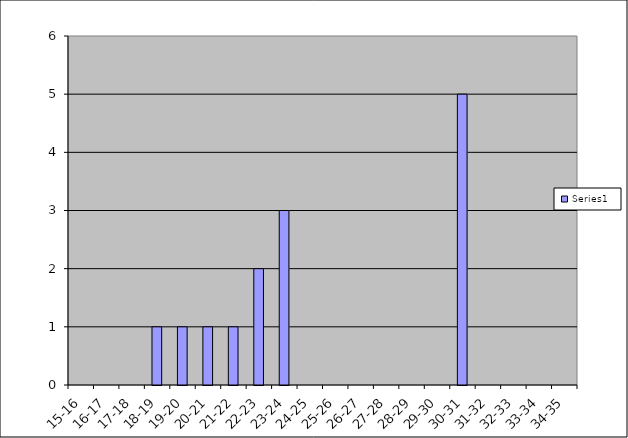
| Category | Series 0 |
|---|---|
| 15-16 | 0 |
| 16-17 | 0 |
| 17-18 | 0 |
| 18-19 | 1 |
| 19-20 | 1 |
| 20-21 | 1 |
| 21-22 | 1 |
| 22-23 | 2 |
| 23-24 | 3 |
| 24-25 | 0 |
| 25-26 | 0 |
| 26-27 | 0 |
| 27-28 | 0 |
| 28-29 | 0 |
| 29-30 | 0 |
| 30-31 | 5 |
| 31-32 | 0 |
| 32-33 | 0 |
| 33-34 | 0 |
| 34-35 | 0 |